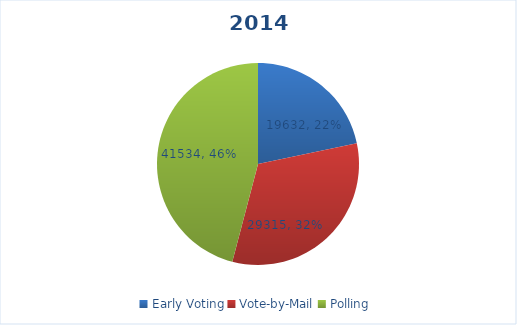
| Category | Series 0 |
|---|---|
| Early Voting | 19632 |
| Vote-by-Mail | 29315 |
| Polling | 41534 |